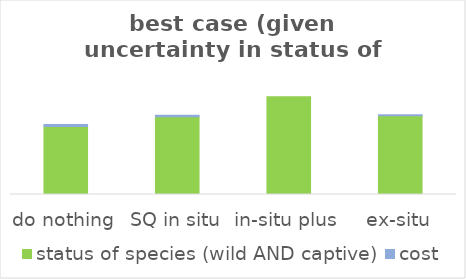
| Category | status of species (wild AND captive) | cost |
|---|---|---|
| do nothing | 0.67 | 0.02 |
| SQ in situ | 0.766 | 0.013 |
| in-situ plus | 0.961 | 0 |
| ex-situ | 0.774 | 0.011 |